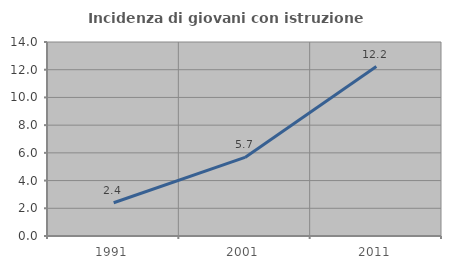
| Category | Incidenza di giovani con istruzione universitaria |
|---|---|
| 1991.0 | 2.398 |
| 2001.0 | 5.669 |
| 2011.0 | 12.23 |